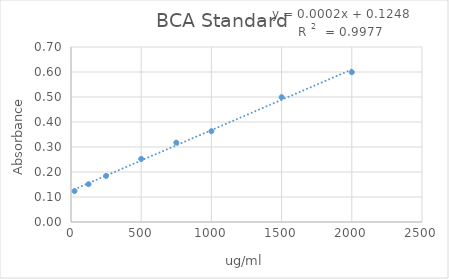
| Category | Series 0 |
|---|---|
| 2000.0 | 0.599 |
| 1500.0 | 0.499 |
| 1000.0 | 0.363 |
| 750.0 | 0.318 |
| 500.0 | 0.252 |
| 250.0 | 0.184 |
| 125.0 | 0.151 |
| 25.0 | 0.124 |